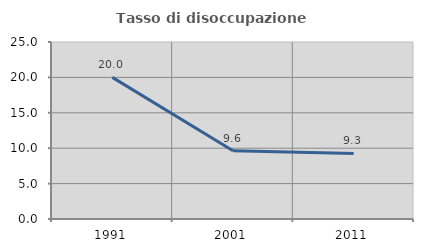
| Category | Tasso di disoccupazione giovanile  |
|---|---|
| 1991.0 | 20 |
| 2001.0 | 9.63 |
| 2011.0 | 9.259 |